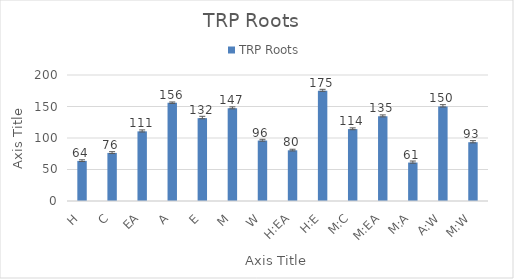
| Category | TRP Roots  |
|---|---|
| H | 63.651 |
| C | 76.313 |
| EA | 110.5 |
| A | 155.84 |
| E | 131.511 |
| M | 147.291 |
| W | 95.947 |
| H:EA | 80.441 |
| H:E | 175.126 |
| M:C | 114.142 |
| M:EA | 134.506 |
| M:A | 61.005 |
| A:W | 150.176 |
| M:W | 93.292 |